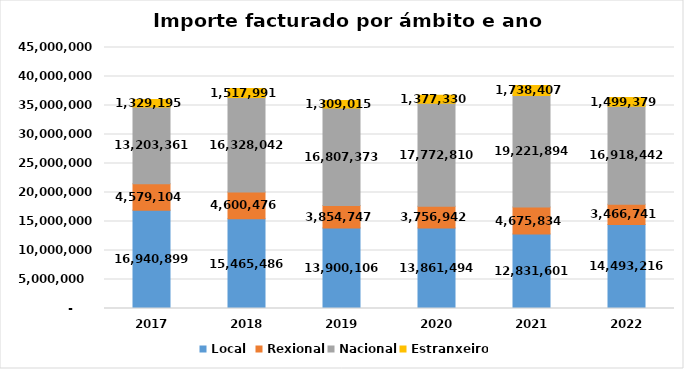
| Category | Local  | Rexional | Nacional | Estranxeiro |
|---|---|---|---|---|
| 2017.0 | 16940898.74 | 4579103.8 | 13203361.04 | 1329194.63 |
| 2018.0 | 15465485.87 | 4600476.29 | 16328042.16 | 1517991.1 |
| 2019.0 | 13900106.15 | 3854747.07 | 16807373.42 | 1309014.91 |
| 2020.0 | 13861493.53 | 3756941.61 | 17772810.06 | 1377330.22 |
| 2021.0 | 12831600.75 | 4675834.23 | 19221893.94 | 1738407.25 |
| 2022.0 | 14493215.78 | 3466741.17 | 16918442.41 | 1499379.3 |